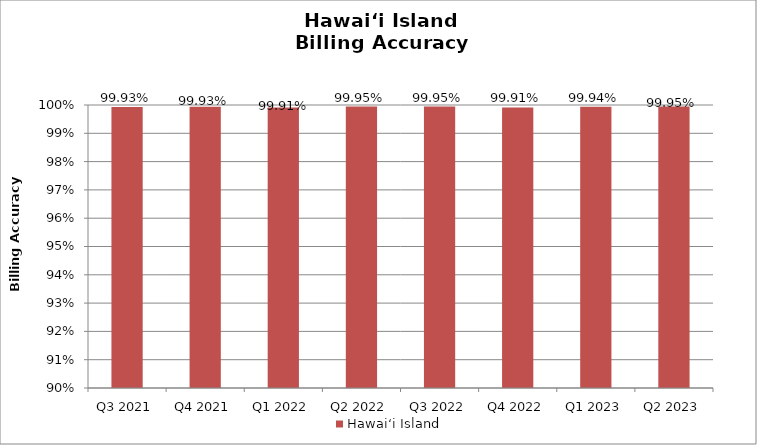
| Category | Hawai‘i Island |
|---|---|
| Q3 2021 | 0.999 |
| Q4 2021 | 0.999 |
| Q1 2022 | 0.999 |
| Q2 2022 | 0.999 |
| Q3 2022 | 0.999 |
| Q4 2022 | 0.999 |
| Q1 2023 | 0.999 |
| Q2 2023 | 1 |